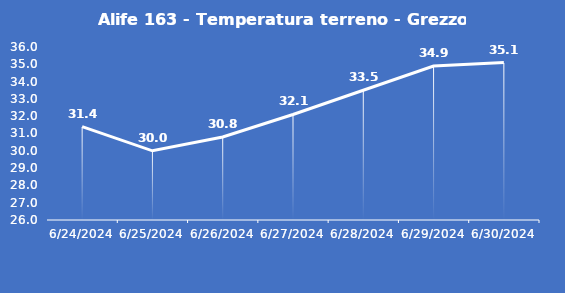
| Category | Alife 163 - Temperatura terreno - Grezzo (°C) |
|---|---|
| 6/24/24 | 31.4 |
| 6/25/24 | 30 |
| 6/26/24 | 30.8 |
| 6/27/24 | 32.1 |
| 6/28/24 | 33.5 |
| 6/29/24 | 34.9 |
| 6/30/24 | 35.1 |